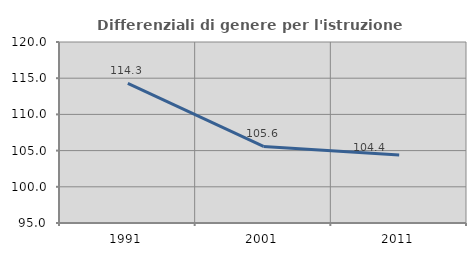
| Category | Differenziali di genere per l'istruzione superiore |
|---|---|
| 1991.0 | 114.29 |
| 2001.0 | 105.572 |
| 2011.0 | 104.406 |